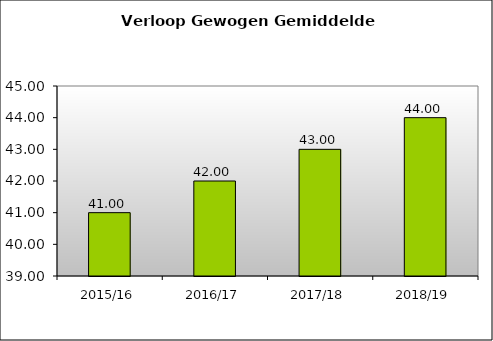
| Category | Series 0 |
|---|---|
| 2015/16 | 41 |
| 2016/17 | 42 |
| 2017/18 | 43 |
| 2018/19 | 44 |